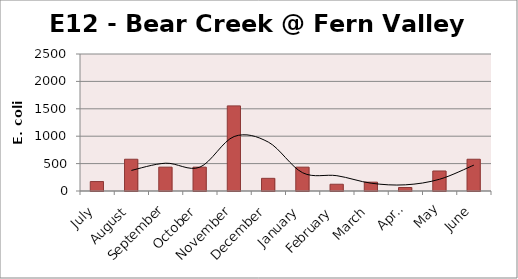
| Category | E. coli MPN |
|---|---|
| July | 172.5 |
| August | 579.4 |
| September | 435.2 |
| October | 435.2 |
| November | 1553.1 |
| December | 231 |
| January | 435.2 |
| February | 123.3 |
| March | 161.6 |
| April | 63.8 |
| May | 365.4 |
| June | 579.4 |